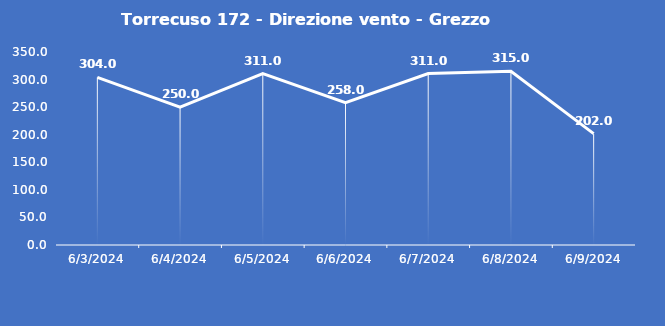
| Category | Torrecuso 172 - Direzione vento - Grezzo (°N) |
|---|---|
| 6/3/24 | 304 |
| 6/4/24 | 250 |
| 6/5/24 | 311 |
| 6/6/24 | 258 |
| 6/7/24 | 311 |
| 6/8/24 | 315 |
| 6/9/24 | 202 |